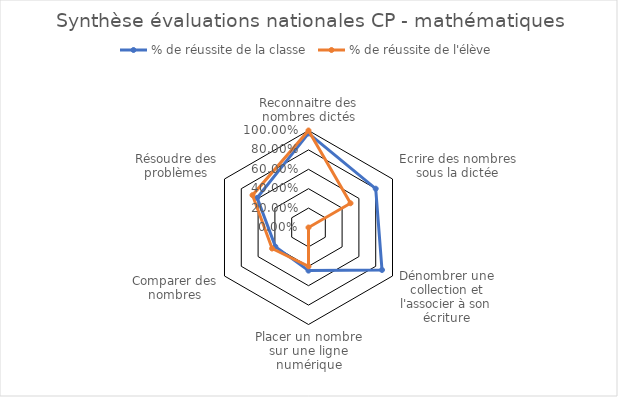
| Category | % de réussite de la classe | % de réussite de l'élève |
|---|---|---|
| Reconnaitre des nombres dictés | 0.97 | 1 |
| Ecrire des nombres sous la dictée | 0.8 | 0.5 |
| Dénombrer une collection et l'associer à son écriture | 0.875 | 0 |
| Placer un nombre sur une ligne numérique | 0.444 | 0.4 |
| Comparer des nombres | 0.394 | 0.433 |
| Résoudre des problèmes | 0.611 | 0.667 |